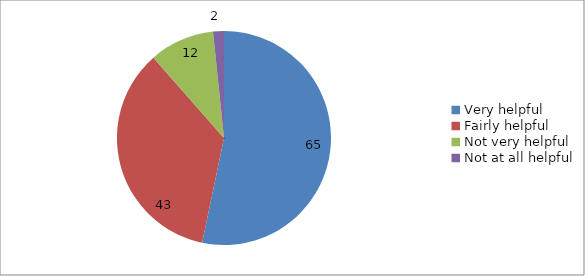
| Category | Series 0 |
|---|---|
| Very helpful | 65 |
| Fairly helpful | 43 |
| Not very helpful | 12 |
| Not at all helpful | 2 |